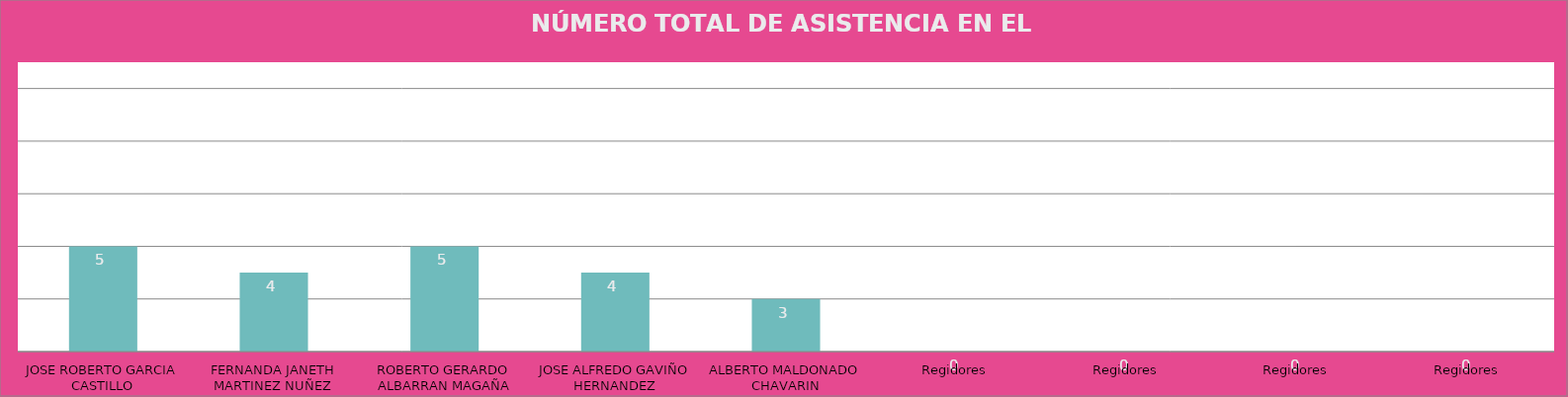
| Category | JOSE ROBERTO GARCIA CASTILLO FERNANDA JANETH MARTINEZ NUÑEZ ROBERTO GERARDO ALBARRAN MAGAÑA JOSE ALFREDO GAVIÑO HERNANDEZ ALBERTO MALDONADO CHAVARIN Regidores Regidores Regidores Regidores |
|---|---|
| JOSE ROBERTO GARCIA CASTILLO | 5 |
| FERNANDA JANETH MARTINEZ NUÑEZ | 4 |
| ROBERTO GERARDO ALBARRAN MAGAÑA | 5 |
| JOSE ALFREDO GAVIÑO HERNANDEZ | 4 |
| ALBERTO MALDONADO CHAVARIN | 3 |
| Regidores | 0 |
| Regidores | 0 |
| Regidores | 0 |
| Regidores | 0 |